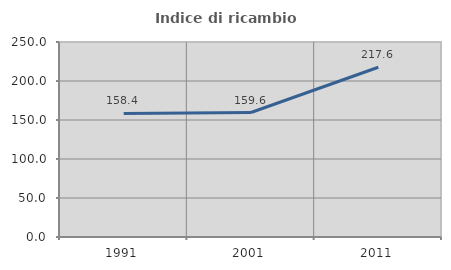
| Category | Indice di ricambio occupazionale  |
|---|---|
| 1991.0 | 158.387 |
| 2001.0 | 159.569 |
| 2011.0 | 217.631 |